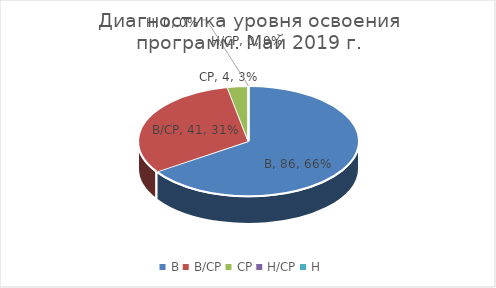
| Category | Series 0 |
|---|---|
| В | 86 |
| В/СР | 41 |
| СР | 4 |
| Н/СР | 0 |
| Н | 0 |